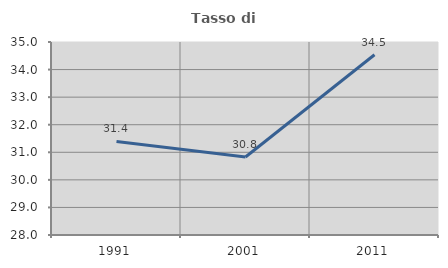
| Category | Tasso di occupazione   |
|---|---|
| 1991.0 | 31.393 |
| 2001.0 | 30.829 |
| 2011.0 | 34.539 |